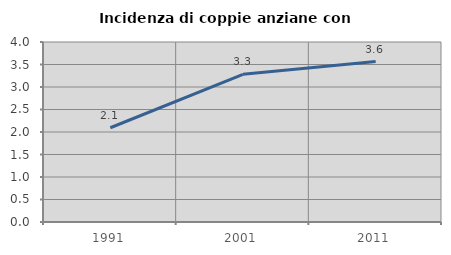
| Category | Incidenza di coppie anziane con figli |
|---|---|
| 1991.0 | 2.095 |
| 2001.0 | 3.281 |
| 2011.0 | 3.564 |